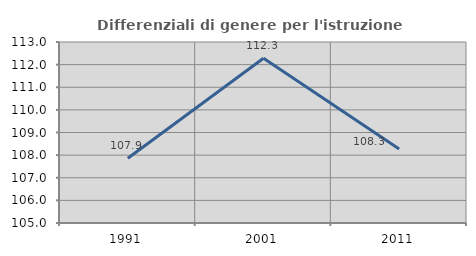
| Category | Differenziali di genere per l'istruzione superiore |
|---|---|
| 1991.0 | 107.862 |
| 2001.0 | 112.281 |
| 2011.0 | 108.273 |